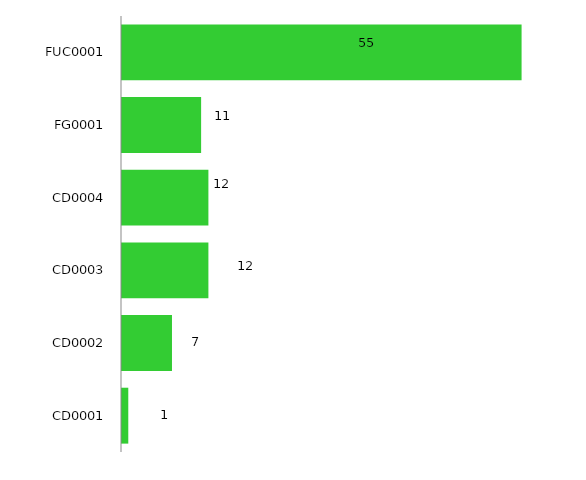
| Category | 2016 |
|---|---|
| CD0001 | 1 |
| CD0002 | 7 |
| CD0003 | 12 |
| CD0004 | 12 |
| FG0001 | 11 |
| FUC0001 | 55 |